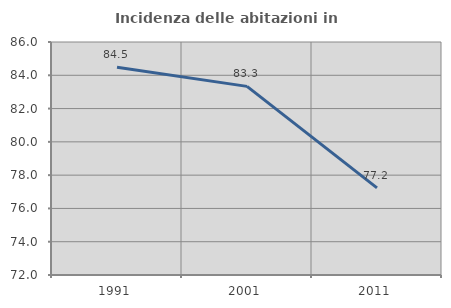
| Category | Incidenza delle abitazioni in proprietà  |
|---|---|
| 1991.0 | 84.481 |
| 2001.0 | 83.333 |
| 2011.0 | 77.236 |